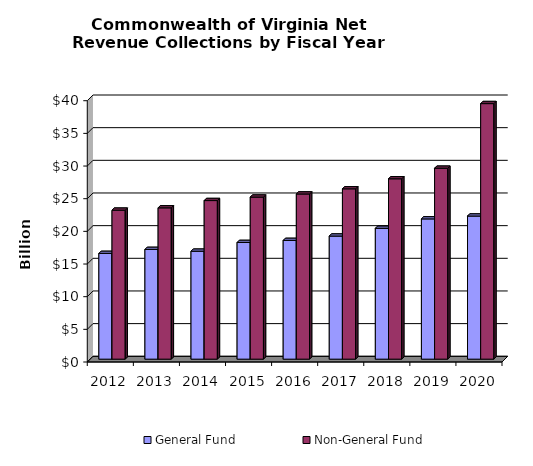
| Category | General Fund | Non-General Fund  |
|---|---|---|
| 2012.0 | 16.182 | 22.803 |
| 2013.0 | 16.792 | 23.162 |
| 2014.0 | 16.52 | 24.275 |
| 2015.0 | 17.857 | 24.805 |
| 2016.0 | 18.17 | 25.28 |
| 2017.0 | 18.84 | 26.074 |
| 2018.0 | 20.024 | 27.609 |
| 2019.0 | 21.467 | 29.225 |
| 2020.0 | 21.904 | 39.12 |